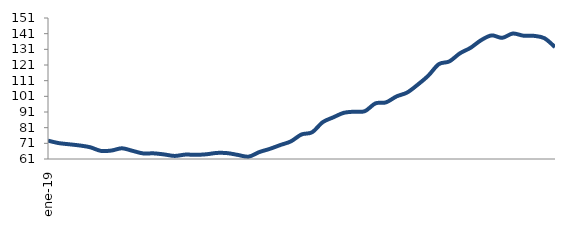
| Category | Series 0 |
|---|---|
| 2019-01-01 | 72.723 |
| 2019-02-01 | 71.168 |
| 2019-03-01 | 70.395 |
| 2019-04-01 | 69.635 |
| 2019-05-01 | 68.49 |
| 2019-06-01 | 66.189 |
| 2019-07-01 | 66.392 |
| 2019-08-01 | 67.837 |
| 2019-09-01 | 66.22 |
| 2019-10-01 | 64.573 |
| 2019-11-01 | 64.608 |
| 2019-12-01 | 63.908 |
| 2020-01-01 | 62.959 |
| 2020-02-01 | 63.811 |
| 2020-03-01 | 63.665 |
| 2020-04-01 | 64.013 |
| 2020-05-01 | 64.885 |
| 2020-06-01 | 64.73 |
| 2020-07-01 | 63.568 |
| 2020-08-01 | 62.507 |
| 2020-09-01 | 65.409 |
| 2020-10-01 | 67.466 |
| 2020-11-01 | 69.929 |
| 2020-12-01 | 72.262 |
| 2021-01-01 | 76.667 |
| 2021-02-01 | 78.05 |
| 2021-03-01 | 84.474 |
| 2021-04-01 | 87.564 |
| 2021-05-01 | 90.47 |
| 2021-06-01 | 91.204 |
| 2021-07-01 | 91.538 |
| 2021-08-01 | 96.497 |
| 2021-09-01 | 97.152 |
| 2021-10-01 | 100.957 |
| 2021-11-01 | 103.422 |
| 2021-12-01 | 108.432 |
| 2022-01-01 | 114.175 |
| 2022-02-01 | 121.528 |
| 2022-03-01 | 123.298 |
| 2022-04-01 | 128.467 |
| 2022-05-01 | 131.948 |
| 2022-06-01 | 136.827 |
| 2022-07-01 | 139.894 |
| 2022-08-01 | 138.341 |
| 2022-09-01 | 141.078 |
| 2022-10-01 | 139.73 |
| 2022-11-01 | 139.602 |
| 2022-12-01 | 138.086 |
| 2023-01-01 | 132.43 |